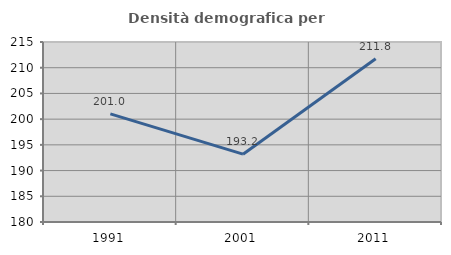
| Category | Densità demografica |
|---|---|
| 1991.0 | 201.016 |
| 2001.0 | 193.187 |
| 2011.0 | 211.758 |